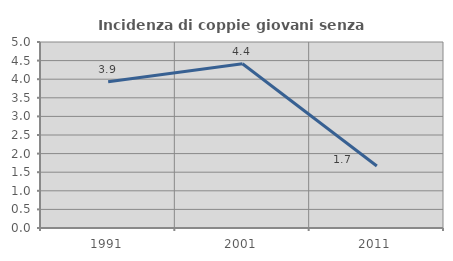
| Category | Incidenza di coppie giovani senza figli |
|---|---|
| 1991.0 | 3.932 |
| 2001.0 | 4.417 |
| 2011.0 | 1.667 |